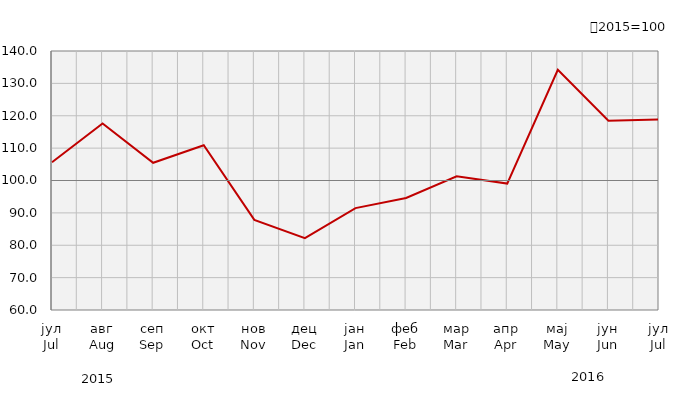
| Category | Индекси ноћења туриста
Tourist night indices |
|---|---|
| јул
Jul | 105.635 |
| авг
Aug | 117.617 |
| сеп
Sep | 105.466 |
| окт
Oct | 110.883 |
| нов
Nov | 87.836 |
| дец
Dec | 82.203 |
| јан
Jan | 91.47 |
| феб
Feb | 94.599 |
| мар
Mar | 101.315 |
| апр
Apr | 99.062 |
| мај
May | 134.186 |
| јун
Jun | 118.44 |
| јул
Jul | 118.819 |